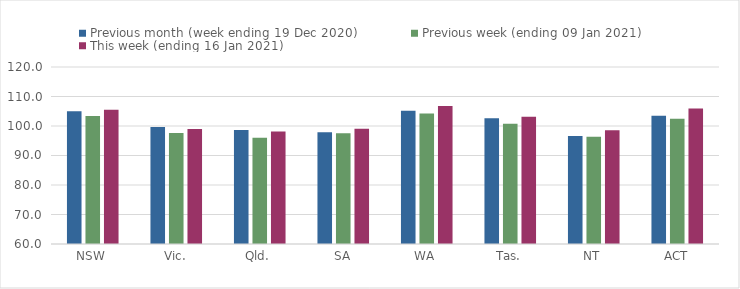
| Category | Previous month (week ending 19 Dec 2020) | Previous week (ending 09 Jan 2021) | This week (ending 16 Jan 2021) |
|---|---|---|---|
| NSW | 104.96 | 103.39 | 105.52 |
| Vic. | 99.69 | 97.65 | 98.99 |
| Qld. | 98.67 | 96.01 | 98.13 |
| SA | 97.9 | 97.54 | 99.07 |
| WA | 105.17 | 104.26 | 106.78 |
| Tas. | 102.62 | 100.8 | 103.13 |
| NT | 96.62 | 96.38 | 98.55 |
| ACT | 103.51 | 102.46 | 105.94 |